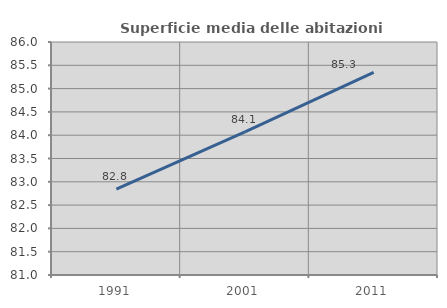
| Category | Superficie media delle abitazioni occupate |
|---|---|
| 1991.0 | 82.844 |
| 2001.0 | 84.072 |
| 2011.0 | 85.346 |